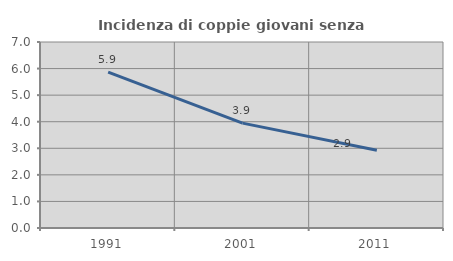
| Category | Incidenza di coppie giovani senza figli |
|---|---|
| 1991.0 | 5.867 |
| 2001.0 | 3.947 |
| 2011.0 | 2.925 |